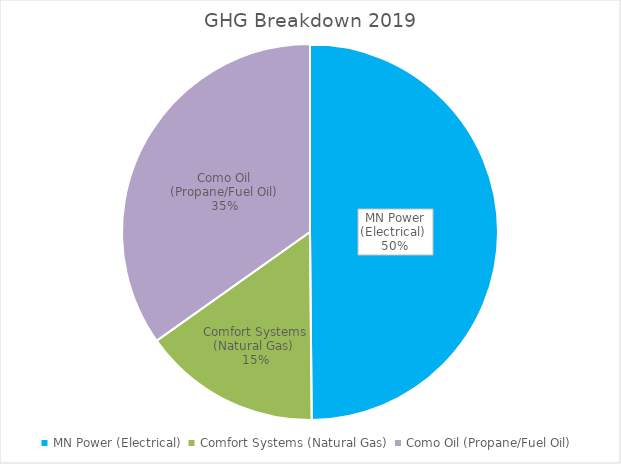
| Category | MN Power (Electrical)  |
|---|---|
| MN Power (Electrical)  | 650.907 |
| Comfort Systems (Natural Gas)  | 200.112 |
| Como Oil (Propane/Fuel Oil) | 454.63 |